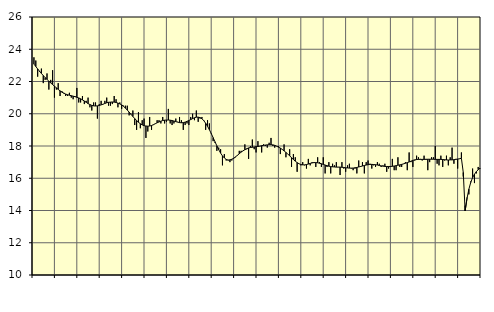
| Category | Piggar | Tillverkning o utvinning, energi o miljö, SNI 05-33, 35-39 |
|---|---|---|
| nan | 23.5 | 23.08 |
| 1.0 | 23.3 | 22.93 |
| 1.0 | 22.3 | 22.78 |
| 1.0 | 22.6 | 22.64 |
| 1.0 | 22.8 | 22.5 |
| 1.0 | 21.9 | 22.37 |
| 1.0 | 22.1 | 22.24 |
| 1.0 | 22.5 | 22.13 |
| 1.0 | 21.5 | 22.02 |
| 1.0 | 22.1 | 21.91 |
| 1.0 | 22.7 | 21.81 |
| 1.0 | 21 | 21.71 |
| nan | 21.5 | 21.61 |
| 2.0 | 21.9 | 21.51 |
| 2.0 | 21.1 | 21.42 |
| 2.0 | 21.4 | 21.34 |
| 2.0 | 21.3 | 21.27 |
| 2.0 | 21.1 | 21.22 |
| 2.0 | 21.1 | 21.18 |
| 2.0 | 21.3 | 21.15 |
| 2.0 | 21 | 21.12 |
| 2.0 | 20.9 | 21.09 |
| 2.0 | 21.1 | 21.06 |
| 2.0 | 21.6 | 21.02 |
| nan | 20.7 | 20.98 |
| 3.0 | 20.7 | 20.93 |
| 3.0 | 21.1 | 20.86 |
| 3.0 | 20.6 | 20.79 |
| 3.0 | 20.8 | 20.71 |
| 3.0 | 21 | 20.63 |
| 3.0 | 20.4 | 20.57 |
| 3.0 | 20.2 | 20.52 |
| 3.0 | 20.7 | 20.49 |
| 3.0 | 20.7 | 20.48 |
| 3.0 | 19.7 | 20.49 |
| 3.0 | 20.6 | 20.51 |
| nan | 20.8 | 20.55 |
| 4.0 | 20.6 | 20.59 |
| 4.0 | 20.8 | 20.64 |
| 4.0 | 21 | 20.68 |
| 4.0 | 20.5 | 20.71 |
| 4.0 | 20.5 | 20.72 |
| 4.0 | 20.6 | 20.73 |
| 4.0 | 21.1 | 20.72 |
| 4.0 | 20.9 | 20.7 |
| 4.0 | 20.4 | 20.66 |
| 4.0 | 20.7 | 20.61 |
| 4.0 | 20.3 | 20.55 |
| nan | 20.5 | 20.46 |
| 5.0 | 20.5 | 20.35 |
| 5.0 | 20.5 | 20.23 |
| 5.0 | 19.9 | 20.1 |
| 5.0 | 20 | 19.96 |
| 5.0 | 20.2 | 19.83 |
| 5.0 | 19.3 | 19.7 |
| 5.0 | 19 | 19.58 |
| 5.0 | 20.1 | 19.47 |
| 5.0 | 19.1 | 19.38 |
| 5.0 | 19.6 | 19.31 |
| 5.0 | 19.7 | 19.26 |
| nan | 18.5 | 19.24 |
| 6.0 | 18.9 | 19.23 |
| 6.0 | 19.8 | 19.24 |
| 6.0 | 19 | 19.27 |
| 6.0 | 19.3 | 19.32 |
| 6.0 | 19.4 | 19.38 |
| 6.0 | 19.6 | 19.44 |
| 6.0 | 19.6 | 19.49 |
| 6.0 | 19.4 | 19.54 |
| 6.0 | 19.8 | 19.58 |
| 6.0 | 19.4 | 19.6 |
| 6.0 | 19.5 | 19.61 |
| nan | 20.3 | 19.61 |
| 7.0 | 19.4 | 19.6 |
| 7.0 | 19.3 | 19.58 |
| 7.0 | 19.4 | 19.55 |
| 7.0 | 19.7 | 19.51 |
| 7.0 | 19.5 | 19.48 |
| 7.0 | 19.8 | 19.45 |
| 7.0 | 19.6 | 19.44 |
| 7.0 | 19 | 19.45 |
| 7.0 | 19.3 | 19.48 |
| 7.0 | 19.4 | 19.53 |
| 7.0 | 19.3 | 19.58 |
| nan | 19.8 | 19.64 |
| 8.0 | 20 | 19.7 |
| 8.0 | 19.6 | 19.75 |
| 8.0 | 20.2 | 19.79 |
| 8.0 | 19.5 | 19.79 |
| 8.0 | 19.7 | 19.76 |
| 8.0 | 19.8 | 19.69 |
| 8.0 | 19.6 | 19.57 |
| 8.0 | 19 | 19.41 |
| 8.0 | 19.6 | 19.22 |
| 8.0 | 19.4 | 19.01 |
| 8.0 | 18.8 | 18.77 |
| nan | 18.3 | 18.52 |
| 9.0 | 18.2 | 18.26 |
| 9.0 | 17.7 | 18.01 |
| 9.0 | 17.9 | 17.77 |
| 9.0 | 17.8 | 17.56 |
| 9.0 | 16.8 | 17.39 |
| 9.0 | 17.5 | 17.26 |
| 9.0 | 17.1 | 17.17 |
| 9.0 | 17.1 | 17.13 |
| 9.0 | 17 | 17.14 |
| 9.0 | 17.1 | 17.18 |
| 9.0 | 17.2 | 17.24 |
| nan | 17.3 | 17.33 |
| 10.0 | 17.4 | 17.42 |
| 10.0 | 17.7 | 17.52 |
| 10.0 | 17.7 | 17.62 |
| 10.0 | 17.7 | 17.7 |
| 10.0 | 18.1 | 17.77 |
| 10.0 | 17.8 | 17.83 |
| 10.0 | 17.2 | 17.88 |
| 10.0 | 18 | 17.91 |
| 10.0 | 18.4 | 17.92 |
| 10.0 | 17.8 | 17.94 |
| 10.0 | 17.6 | 17.96 |
| nan | 18.3 | 17.97 |
| 11.0 | 18 | 17.99 |
| 11.0 | 17.6 | 18.02 |
| 11.0 | 18.1 | 18.04 |
| 11.0 | 18 | 18.06 |
| 11.0 | 17.9 | 18.07 |
| 11.0 | 18.2 | 18.08 |
| 11.0 | 18.5 | 18.08 |
| 11.0 | 18 | 18.07 |
| 11.0 | 17.9 | 18.04 |
| 11.0 | 18 | 17.99 |
| 11.0 | 18 | 17.93 |
| nan | 17.5 | 17.87 |
| 12.0 | 17.8 | 17.79 |
| 12.0 | 18.1 | 17.7 |
| 12.0 | 17.3 | 17.6 |
| 12.0 | 17.5 | 17.5 |
| 12.0 | 17.8 | 17.39 |
| 12.0 | 16.7 | 17.28 |
| 12.0 | 17.5 | 17.16 |
| 12.0 | 17.3 | 17.06 |
| 12.0 | 16.4 | 16.97 |
| 12.0 | 16.9 | 16.9 |
| 12.0 | 16.8 | 16.85 |
| nan | 17 | 16.83 |
| 13.0 | 16.8 | 16.83 |
| 13.0 | 16.6 | 16.85 |
| 13.0 | 17.2 | 16.88 |
| 13.0 | 16.8 | 16.92 |
| 13.0 | 17 | 16.95 |
| 13.0 | 17 | 16.97 |
| 13.0 | 16.7 | 16.97 |
| 13.0 | 17.3 | 16.96 |
| 13.0 | 17 | 16.93 |
| 13.0 | 16.7 | 16.9 |
| 13.0 | 17.3 | 16.86 |
| nan | 16.3 | 16.82 |
| 14.0 | 16.7 | 16.78 |
| 14.0 | 17 | 16.75 |
| 14.0 | 16.3 | 16.72 |
| 14.0 | 16.9 | 16.71 |
| 14.0 | 16.8 | 16.7 |
| 14.0 | 17 | 16.69 |
| 14.0 | 16.7 | 16.69 |
| 14.0 | 16.2 | 16.69 |
| 14.0 | 17 | 16.68 |
| 14.0 | 16.6 | 16.67 |
| 14.0 | 16.4 | 16.65 |
| nan | 16.8 | 16.64 |
| 15.0 | 16.9 | 16.63 |
| 15.0 | 16.6 | 16.63 |
| 15.0 | 16.5 | 16.63 |
| 15.0 | 16.6 | 16.65 |
| 15.0 | 16.3 | 16.67 |
| 15.0 | 17.1 | 16.7 |
| 15.0 | 16.7 | 16.73 |
| 15.0 | 17 | 16.76 |
| 15.0 | 16.3 | 16.79 |
| 15.0 | 17 | 16.82 |
| 15.0 | 17.1 | 16.84 |
| nan | 16.9 | 16.86 |
| 16.0 | 16.6 | 16.86 |
| 16.0 | 16.8 | 16.85 |
| 16.0 | 16.7 | 16.84 |
| 16.0 | 17 | 16.82 |
| 16.0 | 16.9 | 16.79 |
| 16.0 | 16.7 | 16.77 |
| 16.0 | 16.8 | 16.75 |
| 16.0 | 16.9 | 16.73 |
| 16.0 | 16.4 | 16.73 |
| 16.0 | 16.6 | 16.73 |
| 16.0 | 16.7 | 16.73 |
| nan | 17.2 | 16.74 |
| 17.0 | 16.5 | 16.76 |
| 17.0 | 16.5 | 16.78 |
| 17.0 | 17.3 | 16.81 |
| 17.0 | 16.7 | 16.83 |
| 17.0 | 16.7 | 16.86 |
| 17.0 | 16.9 | 16.89 |
| 17.0 | 17 | 16.93 |
| 17.0 | 16.5 | 16.97 |
| 17.0 | 17.6 | 17.01 |
| 17.0 | 17 | 17.06 |
| 17.0 | 16.7 | 17.11 |
| nan | 17.1 | 17.14 |
| 18.0 | 17.4 | 17.16 |
| 18.0 | 17.3 | 17.17 |
| 18.0 | 17.2 | 17.17 |
| 18.0 | 17.1 | 17.17 |
| 18.0 | 17.4 | 17.17 |
| 18.0 | 17.2 | 17.17 |
| 18.0 | 16.5 | 17.18 |
| 18.0 | 17 | 17.18 |
| 18.0 | 17.3 | 17.18 |
| 18.0 | 17.3 | 17.18 |
| 18.0 | 18 | 17.17 |
| nan | 16.9 | 17.17 |
| 19.0 | 16.8 | 17.17 |
| 19.0 | 17.4 | 17.17 |
| 19.0 | 16.7 | 17.16 |
| 19.0 | 17.1 | 17.15 |
| 19.0 | 17.4 | 17.14 |
| 19.0 | 16.8 | 17.13 |
| 19.0 | 17.3 | 17.14 |
| 19.0 | 17.9 | 17.14 |
| 19.0 | 16.9 | 17.15 |
| 19.0 | 17.2 | 17.17 |
| 19.0 | 16.6 | 17.19 |
| nan | 17.2 | 17.21 |
| 20.0 | 17.6 | 17.24 |
| 20.0 | 16.1 | 16.36 |
| 20.0 | 14.3 | 13.97 |
| 20.0 | 14.8 | 14.75 |
| 20.0 | 15 | 15.32 |
| 20.0 | 15.8 | 15.74 |
| 20.0 | 16.6 | 16.04 |
| 20.0 | 15.7 | 16.25 |
| 20.0 | 16.3 | 16.41 |
| 20.0 | 16.7 | 16.53 |
| 20.0 | 16.6 | 16.63 |